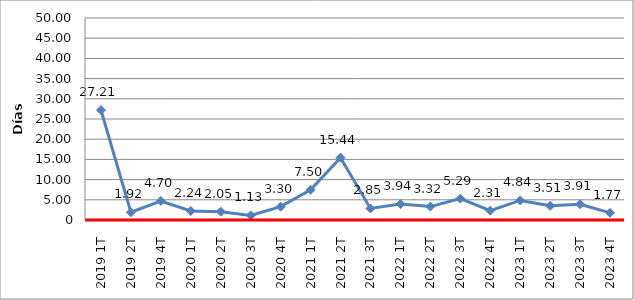
| Category | Total |
|---|---|
| 2019 1T | 27.21 |
| 2019 2T | 1.92 |
| 2019 4T | 4.7 |
| 2020 1T | 2.24 |
| 2020 2T | 2.05 |
| 2020 3T | 1.13 |
| 2020 4T | 3.3 |
| 2021 1T | 7.5 |
| 2021 2T | 15.44 |
| 2021 3T | 2.85 |
| 2022 1T | 3.94 |
| 2022 2T | 3.32 |
| 2022 3T | 5.29 |
| 2022 4T | 2.31 |
| 2023 1T | 4.84 |
| 2023 2T | 3.51 |
| 2023 3T | 3.91 |
| 2023 4T | 1.77 |